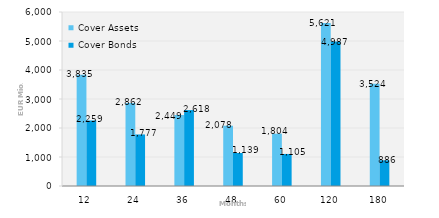
| Category | Cover Assets | Cover Bonds |
|---|---|---|
| 12.0 | 3835.122 | 2259.185 |
| 24.0 | 2861.779 | 1777 |
| 36.0 | 2448.656 | 2618 |
| 48.0 | 2078.088 | 1139 |
| 60.0 | 1803.969 | 1105 |
| 120.0 | 5621.387 | 4986.5 |
| 180.0 | 3524.498 | 886 |